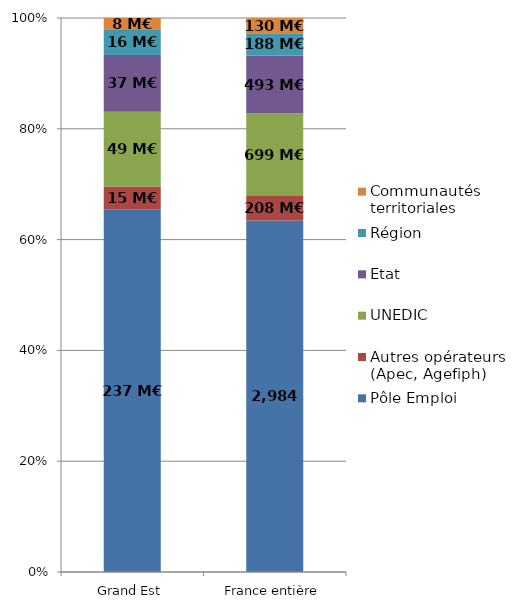
| Category | Pôle Emploi | Autres opérateurs (Apec, Agefiph) | UNEDIC | Etat | Région | Communautés territoriales |
|---|---|---|---|---|---|---|
| Grand Est | 237.148 | 14.746 | 48.868 | 37.139 | 16.407 | 7.789 |
| France entière | 2983.694 | 207.577 | 699.479 | 493.308 | 188.079 | 129.71 |